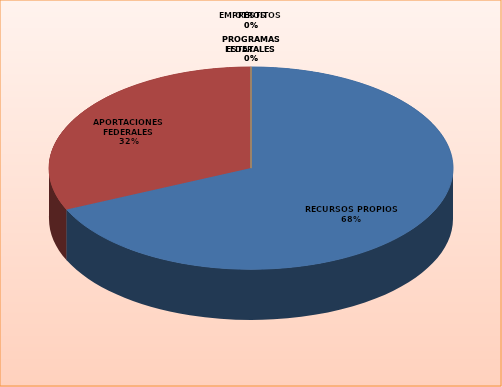
| Category | Series 0 |
|---|---|
| RECURSOS PROPIOS | 20214463 |
| APORTACIONES FEDERALES | 9384643 |
| PROGRAMAS FEDERALES | 0 |
| PROGRAMAS ESTATALES | 0 |
| EMPRÉSTITOS | 0 |
| OTROS | 0 |